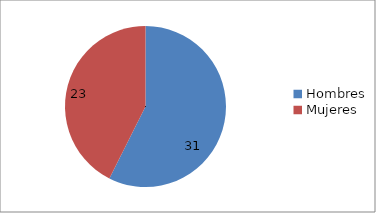
| Category | Series 0 |
|---|---|
| Hombres | 31 |
| Mujeres | 23 |